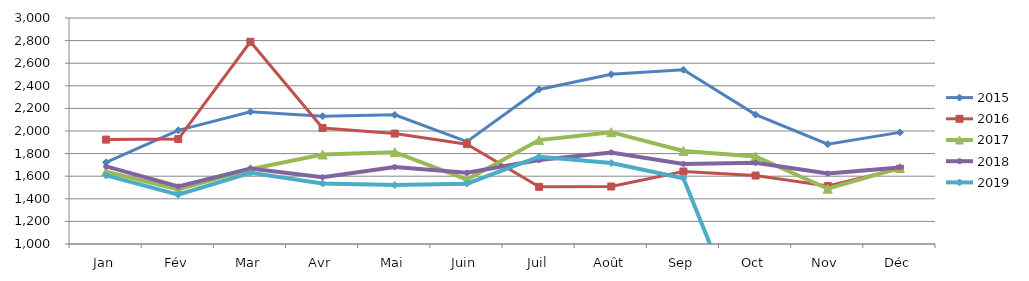
| Category | 2015 | 2016 | 2017 | 2018 | 2019 |
|---|---|---|---|---|---|
| Jan | 1722.709 | 1923.844 | 1640.588 | 1686.867 | 1607.175 |
| Fév | 2005.966 | 1928.725 | 1482.786 | 1508.532 | 1437.165 |
| Mar | 2170.837 | 2789.59 | 1662.652 | 1668.652 | 1629.313 |
| Avr | 2130.693 | 2026.062 | 1792.363 | 1590.954 | 1535.253 |
| Mai | 2142.701 | 1977.297 | 1812.852 | 1680.332 | 1521.753 |
| Juin | 1905.998 | 1883.42 | 1569.867 | 1630.014 | 1533.936 |
| Juil | 2367.564 | 1506.17 | 1919.409 | 1743.106 | 1772.447 |
| Août | 2501.772 | 1508.949 | 1989.564 | 1810.105 | 1716.734 |
| Sep | 2541.368 | 1641.762 | 1823.497 | 1708.545 | 1582.179 |
| Oct | 2144.711 | 1605.922 | 1774.693 | 1718.052 | 0 |
| Nov | 1883.138 | 1513.836 | 1489.145 | 1623.98 | 0 |
| Déc | 1987.813 | 1666.498 | 1673.304 | 1677.915 | 0 |